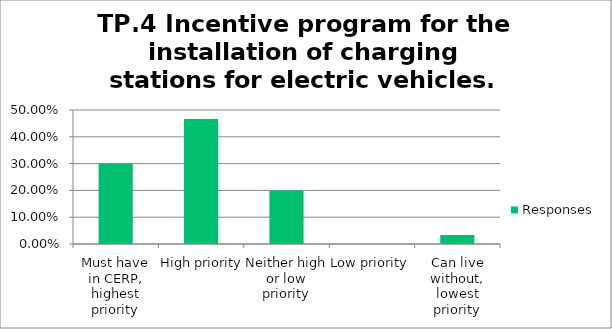
| Category | Responses |
|---|---|
| Must have in CERP, highest priority | 0.3 |
| High priority | 0.467 |
| Neither high or low priority | 0.2 |
| Low priority | 0 |
| Can live without, lowest priority | 0.033 |